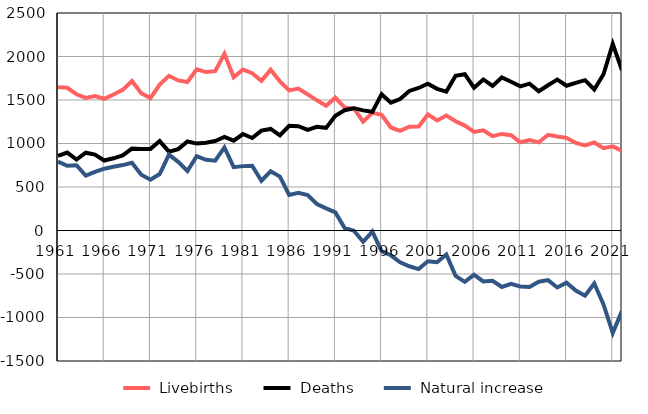
| Category |  Livebirths |  Deaths |  Natural increase |
|---|---|---|---|
| 1961.0 | 1648 | 857 | 791 |
| 1962.0 | 1640 | 896 | 744 |
| 1963.0 | 1566 | 816 | 750 |
| 1964.0 | 1524 | 894 | 630 |
| 1965.0 | 1546 | 872 | 674 |
| 1966.0 | 1514 | 804 | 710 |
| 1967.0 | 1563 | 830 | 733 |
| 1968.0 | 1616 | 864 | 752 |
| 1969.0 | 1719 | 941 | 778 |
| 1970.0 | 1578 | 937 | 641 |
| 1971.0 | 1522 | 938 | 584 |
| 1972.0 | 1677 | 1028 | 649 |
| 1973.0 | 1778 | 906 | 872 |
| 1974.0 | 1725 | 936 | 789 |
| 1975.0 | 1707 | 1023 | 684 |
| 1976.0 | 1853 | 999 | 854 |
| 1977.0 | 1821 | 1009 | 812 |
| 1978.0 | 1832 | 1029 | 803 |
| 1979.0 | 2031 | 1076 | 955 |
| 1980.0 | 1761 | 1033 | 728 |
| 1981.0 | 1849 | 1109 | 740 |
| 1982.0 | 1808 | 1063 | 745 |
| 1983.0 | 1720 | 1148 | 572 |
| 1984.0 | 1848 | 1167 | 681 |
| 1985.0 | 1713 | 1093 | 620 |
| 1986.0 | 1611 | 1203 | 408 |
| 1987.0 | 1632 | 1199 | 433 |
| 1988.0 | 1565 | 1157 | 408 |
| 1989.0 | 1496 | 1192 | 304 |
| 1990.0 | 1434 | 1180 | 254 |
| 1991.0 | 1527 | 1319 | 208 |
| 1992.0 | 1412 | 1383 | 29 |
| 1993.0 | 1404 | 1406 | -2 |
| 1994.0 | 1251 | 1381 | -130 |
| 1995.0 | 1352 | 1364 | -12 |
| 1996.0 | 1329 | 1567 | -238 |
| 1997.0 | 1184 | 1469 | -285 |
| 1998.0 | 1145 | 1511 | -366 |
| 1999.0 | 1193 | 1604 | -411 |
| 2000.0 | 1194 | 1638 | -444 |
| 2001.0 | 1334 | 1687 | -353 |
| 2002.0 | 1264 | 1628 | -364 |
| 2003.0 | 1321 | 1597 | -276 |
| 2004.0 | 1256 | 1778 | -522 |
| 2005.0 | 1206 | 1797 | -591 |
| 2006.0 | 1133 | 1642 | -509 |
| 2007.0 | 1151 | 1736 | -585 |
| 2008.0 | 1084 | 1662 | -578 |
| 2009.0 | 1110 | 1759 | -649 |
| 2010.0 | 1096 | 1710 | -614 |
| 2011.0 | 1014 | 1657 | -643 |
| 2012.0 | 1039 | 1688 | -649 |
| 2013.0 | 1013 | 1601 | -588 |
| 2014.0 | 1100 | 1670 | -570 |
| 2015.0 | 1080 | 1735 | -655 |
| 2016.0 | 1065 | 1664 | -599 |
| 2017.0 | 1006 | 1697 | -691 |
| 2018.0 | 979 | 1728 | -749 |
| 2019.0 | 1012 | 1621 | -609 |
| 2020.0 | 947 | 1796 | -849 |
| 2021.0 | 967 | 2145 | -1178 |
| 2022.0 | 917 | 1841 | -924 |